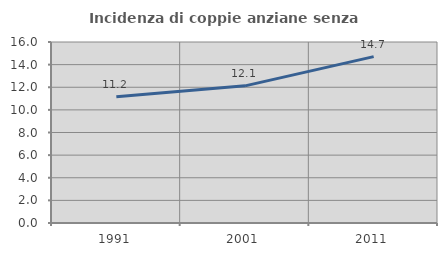
| Category | Incidenza di coppie anziane senza figli  |
|---|---|
| 1991.0 | 11.171 |
| 2001.0 | 12.124 |
| 2011.0 | 14.709 |